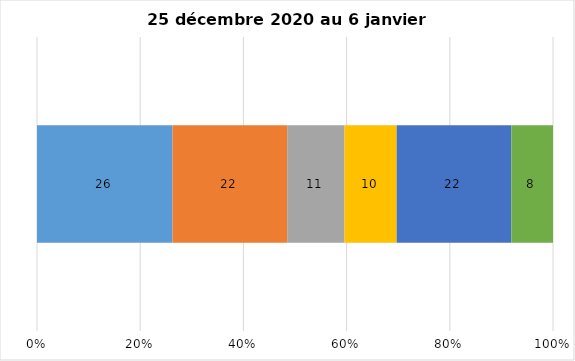
| Category | Plusieurs fois par jour | Une fois par jour | Quelques fois par semaine   | Une fois par semaine ou moins   |  Jamais   |  Je n’utilise pas les médias sociaux |
|---|---|---|---|---|---|---|
| 0 | 26 | 22 | 11 | 10 | 22 | 8 |